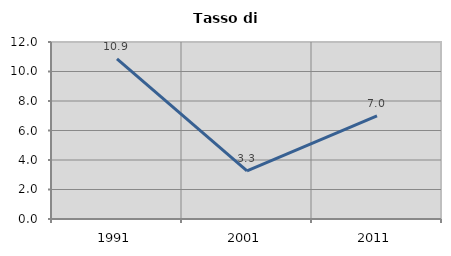
| Category | Tasso di disoccupazione   |
|---|---|
| 1991.0 | 10.85 |
| 2001.0 | 3.266 |
| 2011.0 | 6.998 |